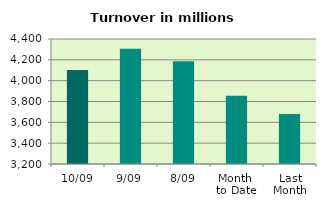
| Category | Series 0 |
|---|---|
| 10/09 | 4102.127 |
| 9/09 | 4307.429 |
| 8/09 | 4186.427 |
| Month 
to Date | 3856.22 |
| Last
Month | 3679.291 |